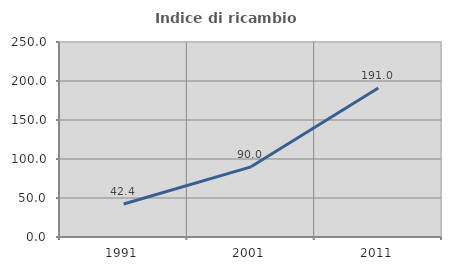
| Category | Indice di ricambio occupazionale  |
|---|---|
| 1991.0 | 42.361 |
| 2001.0 | 89.961 |
| 2011.0 | 191 |